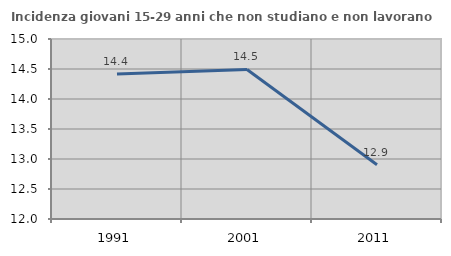
| Category | Incidenza giovani 15-29 anni che non studiano e non lavorano  |
|---|---|
| 1991.0 | 14.415 |
| 2001.0 | 14.493 |
| 2011.0 | 12.903 |